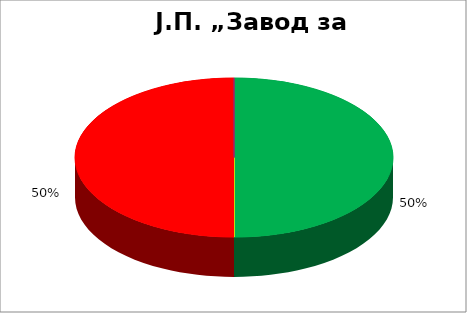
| Category | Ј.П. „Завод за уџбенике“  |
|---|---|
| 0 | 0.5 |
| 1 | 0 |
| 2 | 0 |
| 3 | 0.5 |
| 4 | 0 |